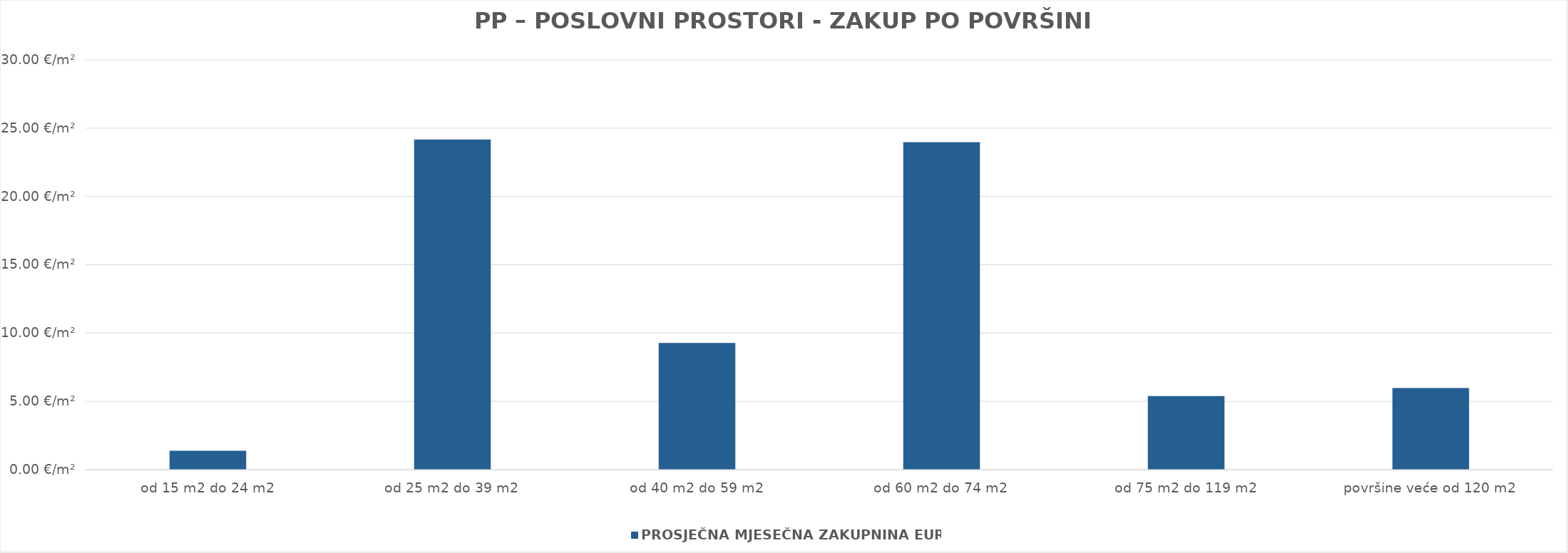
| Category | PROSJEČNA MJESEČNA ZAKUPNINA EUR/m2 |
|---|---|
| od 15 m2 do 24 m2 | 1900-01-01 09:11:12 |
| od 25 m2 do 39 m2 | 1900-01-24 03:58:06 |
| od 40 m2 do 59 m2 | 1900-01-09 06:27:24 |
| od 60 m2 do 74 m2 | 1900-01-23 23:29:13 |
| od 75 m2 do 119 m2 | 1900-01-05 09:25:22 |
| površine veće od 120 m2 | 1900-01-05 23:31:10 |